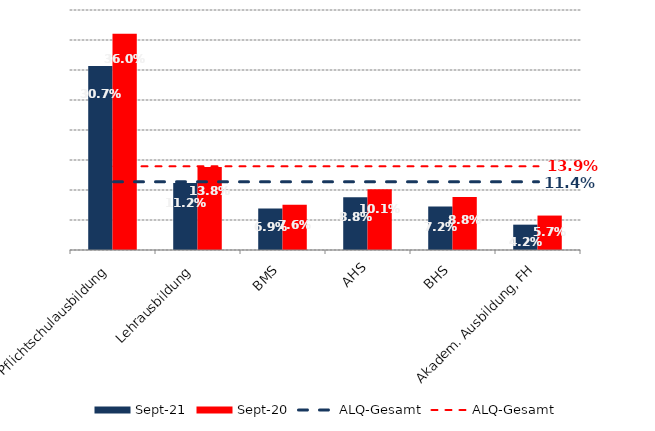
| Category | Sep 21 | Sep 20 |
|---|---|---|
| Pflichtschulausbildung | 0.307 | 0.36 |
| Lehrausbildung | 0.112 | 0.138 |
| BMS | 0.069 | 0.076 |
| AHS | 0.088 | 0.101 |
| BHS | 0.072 | 0.088 |
| Akadem. Ausbildung, FH | 0.042 | 0.057 |